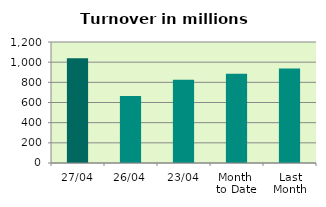
| Category | Series 0 |
|---|---|
| 27/04 | 1038.375 |
| 26/04 | 664.484 |
| 23/04 | 826.204 |
| Month 
to Date | 884.509 |
| Last
Month | 937.305 |